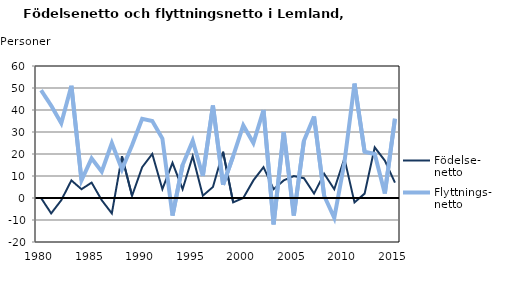
| Category | Födelse- netto | Flyttnings- netto |
|---|---|---|
| 1980.0 | 0 | 49 |
| 1981.0 | -7 | 42 |
| 1982.0 | -1 | 34 |
| 1983.0 | 8 | 51 |
| 1984.0 | 4 | 8 |
| 1985.0 | 7 | 18 |
| 1986.0 | -1 | 12 |
| 1987.0 | -7 | 25 |
| 1988.0 | 19 | 13 |
| 1989.0 | 1 | 24 |
| 1990.0 | 14 | 36 |
| 1991.0 | 20 | 35 |
| 1992.0 | 4 | 27 |
| 1993.0 | 16 | -8 |
| 1994.0 | 4 | 15 |
| 1995.0 | 19 | 26 |
| 1996.0 | 1 | 10 |
| 1997.0 | 5 | 42 |
| 1998.0 | 21 | 6 |
| 1999.0 | -2 | 19 |
| 2000.0 | 0 | 33 |
| 2001.0 | 8 | 25 |
| 2002.0 | 14 | 40 |
| 2003.0 | 4 | -12 |
| 2004.0 | 8 | 30 |
| 2005.0 | 10 | -8 |
| 2006.0 | 9 | 26 |
| 2007.0 | 2 | 37 |
| 2008.0 | 11 | 1 |
| 2009.0 | 4 | -9 |
| 2010.0 | 18 | 16 |
| 2011.0 | -2 | 52 |
| 2012.0 | 2 | 21 |
| 2013.0 | 23 | 20 |
| 2014.0 | 17 | 2 |
| 2015.0 | 7 | 36 |